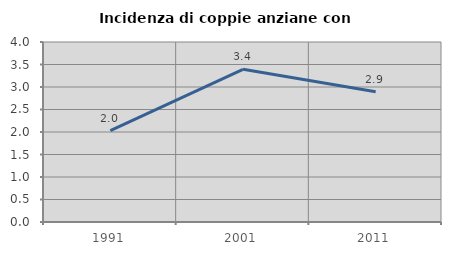
| Category | Incidenza di coppie anziane con figli |
|---|---|
| 1991.0 | 2.029 |
| 2001.0 | 3.394 |
| 2011.0 | 2.895 |